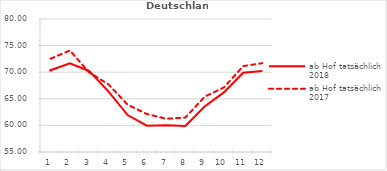
| Category | ab Hof tatsächlich 2018 | ab Hof tatsächlich 2017 |
|---|---|---|
| 0 | 70.361 | 72.539 |
| 1 | 71.659 | 74.086 |
| 2 | 70.233 | 69.96 |
| 3 | 66.387 | 67.733 |
| 4 | 61.944 | 63.893 |
| 5 | 59.94 | 62.137 |
| 6 | 60.01 | 61.251 |
| 7 | 59.883 | 61.47 |
| 8 | 63.557 | 65.378 |
| 9 | 66.198 | 67.133 |
| 10 | 69.892 | 71.144 |
| 11 | 70.236 | 71.697 |